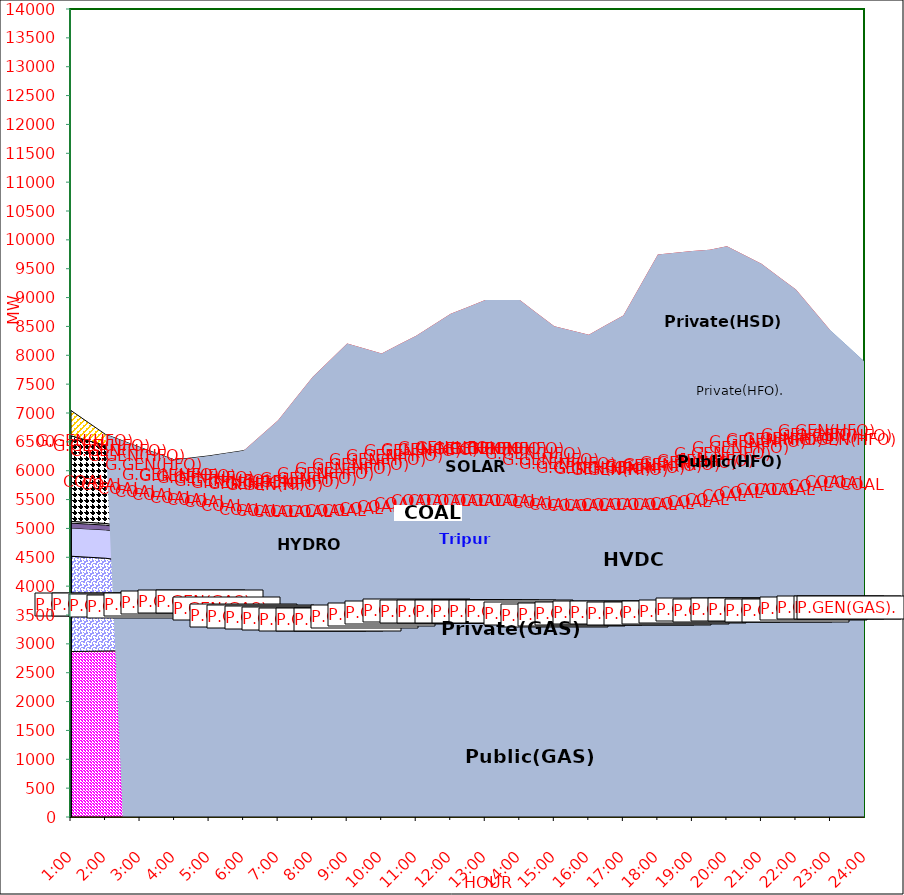
| Category | GAS | P.GEN(GAS). |  HVDC | TRIPURA | HYDRO | COAL | SOLAR | G.GEN(HFO) | P.GEN(HFO). | G.GEN(HSD) | P.GEN(HSD) | SHORTAGE | Total Energy Gen 181.485 MKWHr 
Energy Not Served   13.866 MKWHr 
Energy Requirement     195.351 MKWHr  |
|---|---|---|---|---|---|---|---|---|---|---|---|---|---|
| 1:00 | 2867 | 1651 | 490 | 84 | 30 | 1484 | 0 | 0 | 437 | 0 | 0 | 0 |  |
| 1:30 | 2871.5 | 1629.5 | 490.5 | 83 | 30 | 1416.5 | 0 | 0 | 315 | 0 | 0 | 0 |  |
| 2:00 | 2876 | 1608 | 491 | 82 | 30 | 1349 | 0 | 0 | 193 | 0 | 0 | 0 |  |
| 2:30 | 2880 | 1565 | 491 | 78 | 30 | 1308.5 | 0 | 0 | 164 | 0 | 0 | 0 |  |
| 3:00 | 2884 | 1522 | 491 | 74 | 30 | 1268 | 0 | 0 | 135 | 0 | 0 | 0 |  |
| 3:30 | 2898 | 1572 | 491 | 76 | 30 | 1039 | 0 | 0 | 189.5 | 0 | 0 | 0 |  |
| 4:00 | 2912 | 1622 | 491 | 78 | 30 | 810 | 0 | 0 | 244 | 0 | 0 | 0 |  |
| 4:30 | 2949.5 | 1552.5 | 486.5 | 75 | 30 | 820 | 0 | 0 | 308.5 | 0 | 0 | 0 |  |
| 5:00 | 2987 | 1483 | 482 | 72 | 30 | 830 | 0 | 0 | 373 | 0 | 0 | 0 |  |
| 5:30 | 2847.5 | 1533 | 482 | 75 | 30 | 870.5 | 0 | 0 | 464 | 0 | 0 | 0 |  |
| 6:00 | 2708 | 1583 | 482 | 78 | 30 | 911 | 0 | 0 | 555 | 0 | 0 | 0 |  |
| 6:30 | 2697.5 | 1566.5 | 481.5 | 80 | 30 | 915.5 | 2.5 | 1.5 | 693 | 0 | 0 | 143.305 |  |
| 7:00 | 2687 | 1550 | 481 | 82 | 30 | 920 | 5 | 3 | 831 | 0 | 0 | 286.61 |  |
| 7:30 | 2669.5 | 1551.5 | 481 | 87 | 30 | 949.5 | 37.5 | 17 | 838 | 0 | 0 | 588.886 |  |
| 8:00 | 2652 | 1553 | 481 | 92 | 30 | 979 | 70 | 31 | 845 | 0 | 0 | 891.163 |  |
| 8:30 | 2661 | 1534 | 481 | 95 | 30 | 1005 | 129 | 46 | 875.5 | 0 | 50 | 1007.742 |  |
| 9:00 | 2670 | 1515 | 481 | 98 | 30 | 1031 | 188 | 61 | 906 | 0 | 100 | 1124.322 |  |
| 9:30 | 2722 | 1500 | 481.5 | 99 | 30 | 1030.5 | 221 | 62 | 915 | 0 | 100 | 957.516 |  |
| 10:00 | 2774 | 1485 | 482 | 100 | 30 | 1030 | 254 | 63 | 924 | 0 | 100 | 790.711 |  |
| 10:30 | 2784.5 | 1520 | 482 | 100 | 30 | 1045 | 281.5 | 53 | 986.5 | 0 | 144 | 758.917 |  |
| 11:00 | 2795 | 1555 | 482 | 100 | 30 | 1060 | 309 | 43 | 1049 | 0 | 188 | 727.123 |  |
| 11:30 | 2784 | 1562 | 481.5 | 100 | 30 | 1060 | 322 | 68 | 1097.5 | 0 | 188.5 | 835.408 |  |
| 12:00 | 2773 | 1569 | 481 | 100 | 30 | 1060 | 335 | 93 | 1146 | 0 | 189 | 943.693 |  |
| 12:30 | 2777.5 | 1557 | 481 | 105 | 30 | 1060 | 330.5 | 101.5 | 1148 | 0 | 189 | 1058.846 |  |
| 13:00 | 2782 | 1545 | 481 | 110 | 30 | 1060 | 326 | 110 | 1150 | 0 | 189 | 1174 |  |
| 13:30 | 2782 | 1545 | 481 | 110 | 30 | 1060 | 326 | 110 | 1150 | 0 | 189 | 1174 |  |
| 14:00 | 2782 | 1545 | 481 | 110 | 30 | 1060 | 326 | 110 | 1150 | 0 | 189 | 1174 |  |
| 14:30 | 2759 | 1529.5 | 485.5 | 108 | 30 | 1062 | 262.5 | 113.5 | 1140 | 3.5 | 109.5 | 1127 |  |
| 15:00 | 2736 | 1514 | 490 | 106 | 30 | 1064 | 199 | 117 | 1130 | 7 | 30 | 1080 |  |
| 15:30 | 2750.5 | 1519.5 | 490 | 101 | 30 | 1026 | 147.5 | 120 | 1160 | 12.5 | 30 | 1043 |  |
| 16:00 | 2765 | 1525 | 490 | 96 | 30 | 988 | 96 | 123 | 1190 | 18 | 30 | 1006 |  |
| 16:30 | 2758 | 1556 | 489.5 | 95 | 30 | 959 | 55 | 193 | 1282 | 12.5 | 60.5 | 1033 |  |
| 17:00 | 2751 | 1587 | 489 | 94 | 30 | 930 | 14 | 263 | 1374 | 7 | 91 | 1060 |  |
| 17:30 | 2734.5 | 1595.5 | 490.5 | 102 | 30 | 931 | 7 | 333 | 1637 | 9 | 218.5 | 1131 |  |
| 18:00 | 2718 | 1604 | 492 | 110 | 30 | 932 | 0 | 403 | 1900 | 11 | 346 | 1202 |  |
| 18:30 | 2742 | 1598 | 492 | 112 | 30 | 932.5 | 0 | 418 | 1953.5 | 5.5 | 343 | 1150.5 |  |
| 19:00 | 2766 | 1592 | 492 | 114 | 30 | 933 | 0 | 433 | 2007 | 0 | 340 | 1099 |  |
| 19:30 | 2780 | 1617 | 492 | 114 | 30 | 931 | 0 | 410 | 2057 | 0 | 373 | 1025.5 |  |
| 20:00 | 2784 | 1605 | 491 | 112 | 30 | 1084 | 0 | 386 | 2101 | 0 | 346 | 952 |  |
| 20:30 | 2793 | 1603 | 491.5 | 112 | 30 | 1181.5 | 0 | 387.5 | 2054 | 0 | 269 | 817.5 |  |
| 21:00 | 2802 | 1601 | 492 | 112 | 30 | 1279 | 0 | 389 | 2007 | 0 | 192 | 683 |  |
| 21:30 | 2800 | 1573 | 492 | 110 | 30 | 1345 | 0 | 365.5 | 2003.5 | 0 | 177 | 466.5 |  |
| 22:00 | 2798 | 1545 | 492 | 108 | 30 | 1411 | 0 | 342 | 2000 | 0 | 162 | 250 |  |
| 22:30 | 2805 | 1598.5 | 492 | 106 | 30 | 1437 | 0 | 310.5 | 1748 | 0 | 132 | 125 |  |
| 23:00 | 2812 | 1652 | 492 | 104 | 30 | 1463 | 0 | 279 | 1496 | 0 | 102 | 0 |  |
| 23:30 | 2813 | 1633.5 | 492.5 | 99 | 30 | 1453 | 0 | 183.5 | 1399 | 0 | 51 | 0 |  |
| 24:00 | 2814 | 1615 | 493 | 94 | 30 | 1443 | 0 | 88 | 1302 | 0 | 0 | 0 |  |